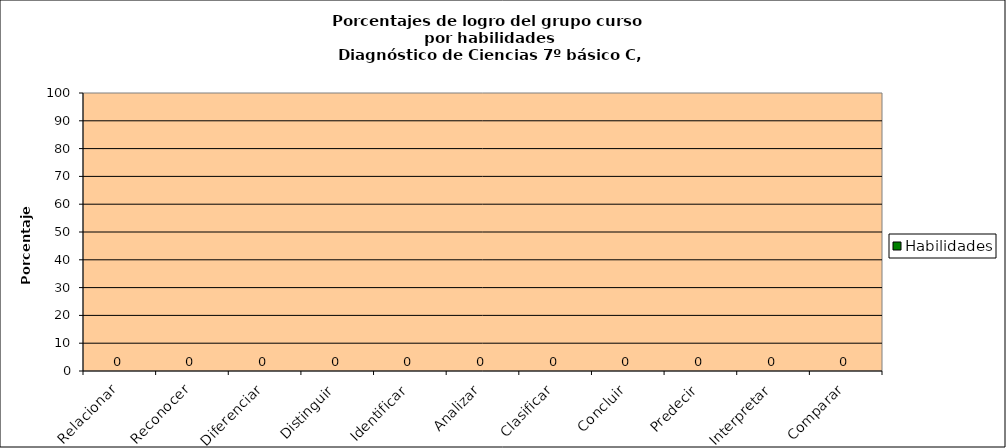
| Category | Habilidades |
|---|---|
| Relacionar | 0 |
| Reconocer | 0 |
| Diferenciar | 0 |
| Distinguir | 0 |
| Identificar | 0 |
| Analizar | 0 |
| Clasificar | 0 |
| Concluir | 0 |
| Predecir | 0 |
| Interpretar | 0 |
| Comparar | 0 |